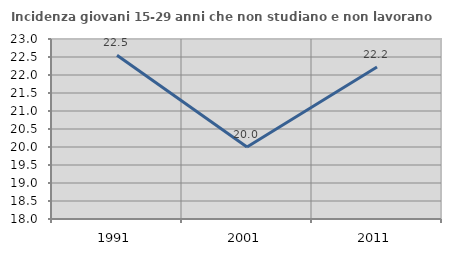
| Category | Incidenza giovani 15-29 anni che non studiano e non lavorano  |
|---|---|
| 1991.0 | 22.549 |
| 2001.0 | 20 |
| 2011.0 | 22.222 |